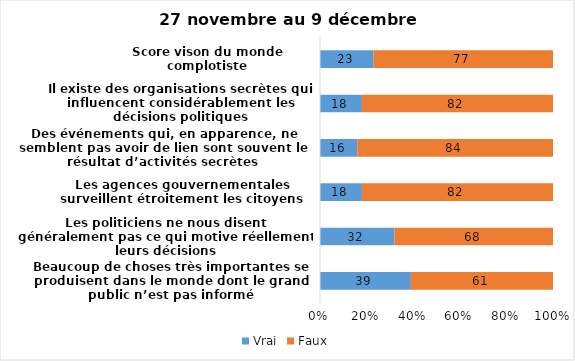
| Category | Vrai | Faux |
|---|---|---|
| Beaucoup de choses très importantes se produisent dans le monde dont le grand public n’est pas informé | 39 | 61 |
| Les politiciens ne nous disent généralement pas ce qui motive réellement leurs décisions | 32 | 68 |
| Les agences gouvernementales surveillent étroitement les citoyens | 18 | 82 |
| Des événements qui, en apparence, ne semblent pas avoir de lien sont souvent le résultat d’activités secrètes | 16 | 84 |
| Il existe des organisations secrètes qui influencent considérablement les décisions politiques | 18 | 82 |
| Score vison du monde complotiste | 23 | 77 |